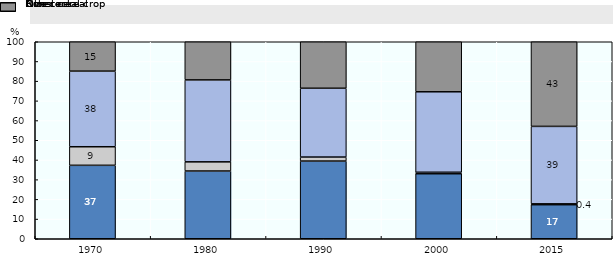
| Category | Rice | Other cereal | Non-cereal crop | Livestock |
|---|---|---|---|---|
| 1970.0 | 37.283 | 9.419 | 38.38 | 14.917 |
| 1980.0 | 34.385 | 4.66 | 41.592 | 19.364 |
| 1990.0 | 39.439 | 2.029 | 34.934 | 23.597 |
| 2000.0 | 33.003 | 0.751 | 40.853 | 25.393 |
| 2015.0 | 17.29 | 0.432 | 39.317 | 42.961 |